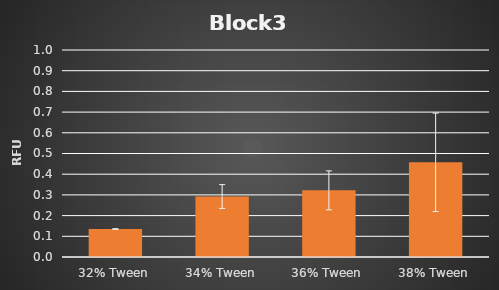
| Category | Block3 |
|---|---|
| 32% Tween | 0.135 |
| 34% Tween | 0.292 |
| 36% Tween | 0.322 |
| 38% Tween | 0.457 |